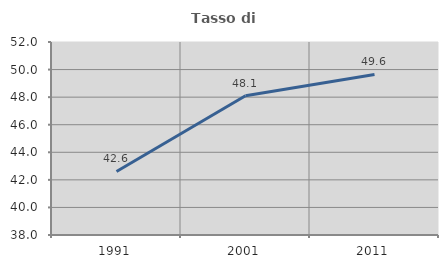
| Category | Tasso di occupazione   |
|---|---|
| 1991.0 | 42.61 |
| 2001.0 | 48.103 |
| 2011.0 | 49.645 |